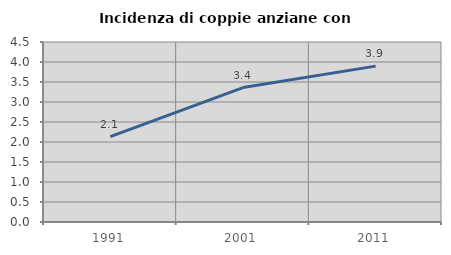
| Category | Incidenza di coppie anziane con figli |
|---|---|
| 1991.0 | 2.136 |
| 2001.0 | 3.36 |
| 2011.0 | 3.897 |